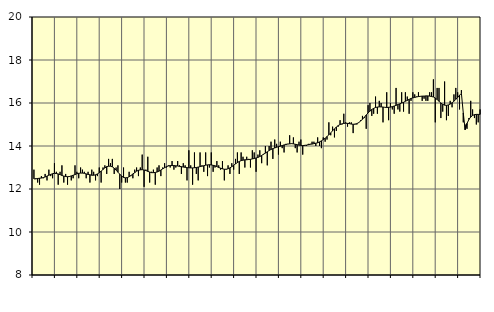
| Category | Piggar | Utbildning, SNI 85 |
|---|---|---|
| nan | 12.9 | 12.47 |
| 1.0 | 12.5 | 12.47 |
| 1.0 | 12.3 | 12.49 |
| 1.0 | 12.2 | 12.5 |
| 1.0 | 12.6 | 12.51 |
| 1.0 | 12.5 | 12.53 |
| 1.0 | 12.7 | 12.56 |
| 1.0 | 12.4 | 12.6 |
| 1.0 | 12.9 | 12.64 |
| 1.0 | 12.6 | 12.68 |
| 1.0 | 12.5 | 12.71 |
| 1.0 | 13.2 | 12.73 |
| nan | 12.8 | 12.72 |
| 2.0 | 12.2 | 12.7 |
| 2.0 | 12.8 | 12.67 |
| 2.0 | 13.1 | 12.63 |
| 2.0 | 12.3 | 12.6 |
| 2.0 | 12.7 | 12.58 |
| 2.0 | 12.2 | 12.57 |
| 2.0 | 12.6 | 12.58 |
| 2.0 | 12.4 | 12.61 |
| 2.0 | 12.5 | 12.64 |
| 2.0 | 13.1 | 12.67 |
| 2.0 | 12.8 | 12.71 |
| nan | 12.5 | 12.73 |
| 3.0 | 13 | 12.74 |
| 3.0 | 12.9 | 12.74 |
| 3.0 | 12.8 | 12.73 |
| 3.0 | 12.5 | 12.7 |
| 3.0 | 12.8 | 12.68 |
| 3.0 | 12.3 | 12.66 |
| 3.0 | 12.9 | 12.64 |
| 3.0 | 12.8 | 12.64 |
| 3.0 | 12.4 | 12.66 |
| 3.0 | 12.6 | 12.7 |
| 3.0 | 13 | 12.76 |
| nan | 12.3 | 12.83 |
| 4.0 | 13 | 12.91 |
| 4.0 | 13.1 | 12.98 |
| 4.0 | 12.7 | 13.04 |
| 4.0 | 13.4 | 13.06 |
| 4.0 | 13.2 | 13.06 |
| 4.0 | 13.4 | 13.03 |
| 4.0 | 12.7 | 12.97 |
| 4.0 | 13 | 12.88 |
| 4.0 | 13.1 | 12.78 |
| 4.0 | 12 | 12.69 |
| 4.0 | 12.3 | 12.6 |
| nan | 13 | 12.54 |
| 5.0 | 12.3 | 12.52 |
| 5.0 | 12.3 | 12.53 |
| 5.0 | 12.8 | 12.57 |
| 5.0 | 12.6 | 12.63 |
| 5.0 | 12.5 | 12.7 |
| 5.0 | 12.9 | 12.76 |
| 5.0 | 13 | 12.83 |
| 5.0 | 12.6 | 12.87 |
| 5.0 | 13 | 12.89 |
| 5.0 | 13.6 | 12.9 |
| 5.0 | 12.1 | 12.88 |
| nan | 12.9 | 12.86 |
| 6.0 | 13.5 | 12.82 |
| 6.0 | 12.3 | 12.79 |
| 6.0 | 12.8 | 12.76 |
| 6.0 | 12.9 | 12.76 |
| 6.0 | 12.2 | 12.77 |
| 6.0 | 13 | 12.79 |
| 6.0 | 13.1 | 12.83 |
| 6.0 | 12.6 | 12.88 |
| 6.0 | 13 | 12.94 |
| 6.0 | 13.2 | 12.99 |
| 6.0 | 13 | 13.04 |
| nan | 13.1 | 13.07 |
| 7.0 | 13 | 13.09 |
| 7.0 | 13.3 | 13.09 |
| 7.0 | 12.9 | 13.09 |
| 7.0 | 13 | 13.08 |
| 7.0 | 13.3 | 13.07 |
| 7.0 | 13.1 | 13.05 |
| 7.0 | 12.7 | 13.04 |
| 7.0 | 13.2 | 13.02 |
| 7.0 | 13.1 | 13.01 |
| 7.0 | 12.4 | 12.99 |
| 7.0 | 13.8 | 12.99 |
| nan | 13.1 | 12.98 |
| 8.0 | 12.2 | 12.98 |
| 8.0 | 13.7 | 12.99 |
| 8.0 | 12.7 | 13 |
| 8.0 | 12.4 | 13.02 |
| 8.0 | 13.7 | 13.04 |
| 8.0 | 13.1 | 13.06 |
| 8.0 | 12.8 | 13.08 |
| 8.0 | 13.7 | 13.11 |
| 8.0 | 12.6 | 13.12 |
| 8.0 | 13 | 13.13 |
| 8.0 | 13.7 | 13.12 |
| nan | 12.8 | 13.1 |
| 9.0 | 13 | 13.08 |
| 9.0 | 13.3 | 13.04 |
| 9.0 | 13.1 | 13 |
| 9.0 | 12.9 | 12.97 |
| 9.0 | 13.3 | 12.94 |
| 9.0 | 12.4 | 12.92 |
| 9.0 | 12.9 | 12.92 |
| 9.0 | 13.1 | 12.94 |
| 9.0 | 12.7 | 12.98 |
| 9.0 | 13.2 | 13.04 |
| 9.0 | 12.9 | 13.1 |
| nan | 13.4 | 13.17 |
| 10.0 | 13.7 | 13.23 |
| 10.0 | 12.7 | 13.28 |
| 10.0 | 13.7 | 13.32 |
| 10.0 | 13.5 | 13.34 |
| 10.0 | 13 | 13.36 |
| 10.0 | 13.5 | 13.36 |
| 10.0 | 13.4 | 13.37 |
| 10.0 | 13 | 13.38 |
| 10.0 | 13.8 | 13.4 |
| 10.0 | 13.7 | 13.42 |
| 10.0 | 12.8 | 13.44 |
| nan | 13.6 | 13.47 |
| 11.0 | 13.8 | 13.51 |
| 11.0 | 13.2 | 13.56 |
| 11.0 | 13.6 | 13.62 |
| 11.0 | 14 | 13.67 |
| 11.0 | 13.1 | 13.73 |
| 11.0 | 14 | 13.79 |
| 11.0 | 14.2 | 13.84 |
| 11.0 | 13.4 | 13.88 |
| 11.0 | 14.3 | 13.91 |
| 11.0 | 14.1 | 13.94 |
| 11.0 | 13.6 | 13.97 |
| nan | 14.2 | 13.99 |
| 12.0 | 13.9 | 14.02 |
| 12.0 | 13.7 | 14.05 |
| 12.0 | 14.1 | 14.07 |
| 12.0 | 14.1 | 14.09 |
| 12.0 | 14.5 | 14.1 |
| 12.0 | 14.1 | 14.11 |
| 12.0 | 14.4 | 14.1 |
| 12.0 | 13.9 | 14.08 |
| 12.0 | 13.7 | 14.06 |
| 12.0 | 14.2 | 14.04 |
| 12.0 | 14.3 | 14.03 |
| nan | 13.6 | 14.02 |
| 13.0 | 14 | 14.03 |
| 13.0 | 14 | 14.04 |
| 13.0 | 14.1 | 14.06 |
| 13.0 | 14.1 | 14.08 |
| 13.0 | 14.2 | 14.09 |
| 13.0 | 14.2 | 14.11 |
| 13.0 | 14 | 14.13 |
| 13.0 | 14.4 | 14.15 |
| 13.0 | 14 | 14.19 |
| 13.0 | 13.9 | 14.24 |
| 13.0 | 14.4 | 14.3 |
| nan | 14.2 | 14.36 |
| 14.0 | 14.3 | 14.44 |
| 14.0 | 15.1 | 14.52 |
| 14.0 | 14.5 | 14.61 |
| 14.0 | 14.9 | 14.71 |
| 14.0 | 14.4 | 14.8 |
| 14.0 | 14.7 | 14.88 |
| 14.0 | 14.9 | 14.95 |
| 14.0 | 15.2 | 15 |
| 14.0 | 15 | 15.03 |
| 14.0 | 15.5 | 15.05 |
| 14.0 | 15.1 | 15.06 |
| nan | 14.9 | 15.05 |
| 15.0 | 15.1 | 15.04 |
| 15.0 | 15.1 | 15.02 |
| 15.0 | 14.6 | 15.01 |
| 15.0 | 15 | 15.02 |
| 15.0 | 15 | 15.04 |
| 15.0 | 15.1 | 15.09 |
| 15.0 | 15.2 | 15.16 |
| 15.0 | 15.4 | 15.24 |
| 15.0 | 15.3 | 15.34 |
| 15.0 | 14.8 | 15.44 |
| 15.0 | 15.9 | 15.54 |
| nan | 16 | 15.62 |
| 16.0 | 15.4 | 15.7 |
| 16.0 | 15.5 | 15.75 |
| 16.0 | 16.3 | 15.79 |
| 16.0 | 15.5 | 15.81 |
| 16.0 | 16.1 | 15.82 |
| 16.0 | 16 | 15.82 |
| 16.0 | 15.1 | 15.81 |
| 16.0 | 15.8 | 15.8 |
| 16.0 | 16.5 | 15.79 |
| 16.0 | 15.2 | 15.8 |
| 16.0 | 16 | 15.81 |
| nan | 15.7 | 15.83 |
| 17.0 | 15.5 | 15.86 |
| 17.0 | 16.7 | 15.89 |
| 17.0 | 15.7 | 15.93 |
| 17.0 | 15.6 | 15.96 |
| 17.0 | 16.5 | 16 |
| 17.0 | 15.6 | 16.03 |
| 17.0 | 16.5 | 16.08 |
| 17.0 | 16.3 | 16.12 |
| 17.0 | 15.5 | 16.17 |
| 17.0 | 16.1 | 16.21 |
| 17.0 | 16.5 | 16.24 |
| nan | 16.4 | 16.26 |
| 18.0 | 16.3 | 16.28 |
| 18.0 | 16.5 | 16.3 |
| 18.0 | 16.3 | 16.31 |
| 18.0 | 16.1 | 16.32 |
| 18.0 | 16.2 | 16.32 |
| 18.0 | 16.1 | 16.33 |
| 18.0 | 16.1 | 16.33 |
| 18.0 | 16.5 | 16.32 |
| 18.0 | 16.5 | 16.3 |
| 18.0 | 17.1 | 16.28 |
| 18.0 | 15.1 | 16.23 |
| nan | 16.7 | 16.16 |
| 19.0 | 16.7 | 16.08 |
| 19.0 | 15.3 | 16 |
| 19.0 | 15.6 | 15.94 |
| 19.0 | 17 | 15.9 |
| 19.0 | 15.2 | 15.89 |
| 19.0 | 15.4 | 15.91 |
| 19.0 | 16.1 | 15.95 |
| 19.0 | 15.8 | 16.01 |
| 19.0 | 16.4 | 16.08 |
| 19.0 | 16.7 | 16.17 |
| 19.0 | 16.5 | 16.26 |
| nan | 15.7 | 16.36 |
| 20.0 | 16.6 | 16.45 |
| 20.0 | 15.1 | 15.54 |
| 20.0 | 15 | 14.76 |
| 20.0 | 14.8 | 15.05 |
| 20.0 | 15.3 | 15.23 |
| 20.0 | 16.1 | 15.35 |
| 20.0 | 15.7 | 15.42 |
| 20.0 | 15.3 | 15.46 |
| 20.0 | 15 | 15.47 |
| 20.0 | 15.1 | 15.47 |
| 20.0 | 15.7 | 15.47 |